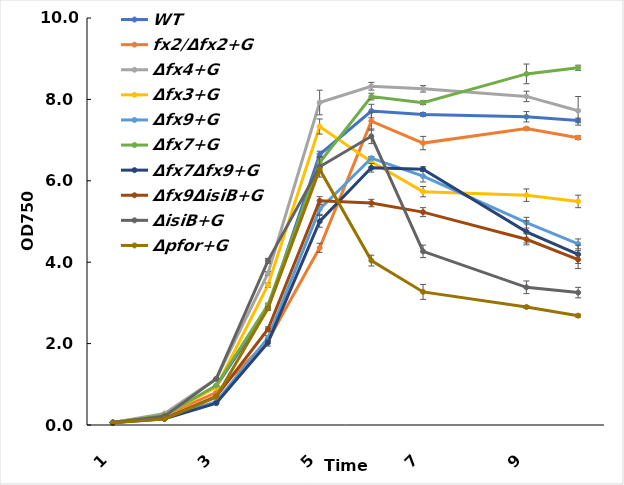
| Category | WT | fx2/Δfx2+G | Δfx4+G | Δfx3+G | Δfx9+G | Δfx7+G | Δfx7Δfx9+G | Δfx9ΔisiB+G | ΔisiB+G | Δpfor+G |
|---|---|---|---|---|---|---|---|---|---|---|
| 1.0 | 0.062 | 0.061 | 0.059 | 0.056 | 0.063 | 0.06 | 0.062 | 0.061 | 0.058 | 0.056 |
| 2.0 | 0.236 | 0.238 | 0.283 | 0.238 | 0.16 | 0.24 | 0.152 | 0.164 | 0.217 | 0.146 |
| 3.0 | 0.946 | 0.797 | 1.138 | 0.932 | 0.571 | 0.971 | 0.536 | 0.701 | 1.134 | 0.686 |
| 4.0 | 2.873 | 2.077 | 3.723 | 3.437 | 2.14 | 2.95 | 2.023 | 2.353 | 4.033 | 2.867 |
| 5.0 | 6.647 | 4.353 | 7.923 | 7.333 | 5.3 | 6.45 | 5.003 | 5.51 | 6.343 | 6.28 |
| 6.0 | 7.713 | 7.467 | 8.323 | 6.467 | 6.557 | 8.07 | 6.32 | 5.453 | 7.093 | 4.04 |
| 7.0 | 7.63 | 6.927 | 8.26 | 5.733 | 6.113 | 7.92 | 6.287 | 5.23 | 4.267 | 3.27 |
| 9.0 | 7.573 | 7.283 | 8.073 | 5.647 | 4.97 | 8.627 | 4.747 | 4.563 | 3.383 | 2.9 |
| 10.0 | 7.483 | 7.06 | 7.72 | 5.493 | 4.45 | 8.777 | 4.193 | 4.063 | 3.253 | 2.687 |